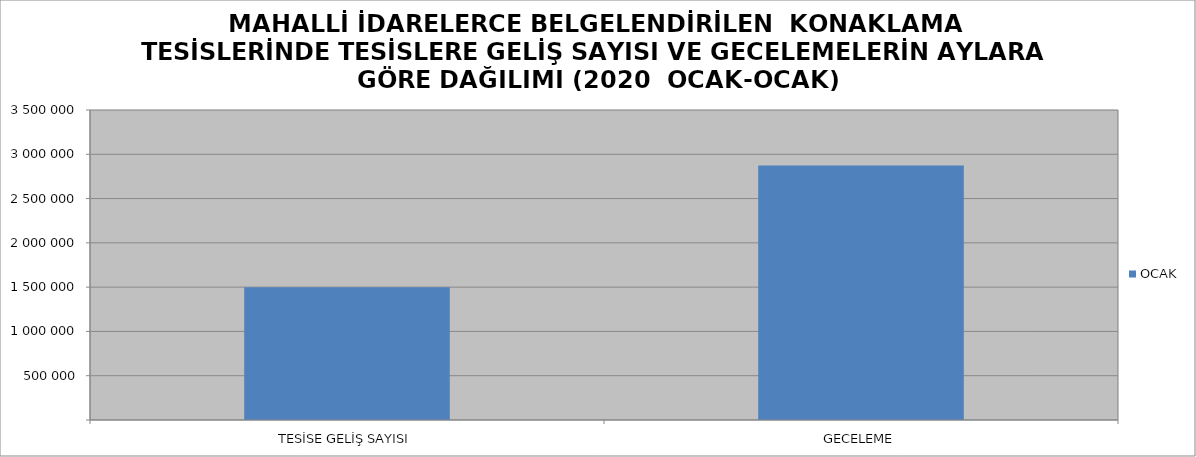
| Category | OCAK |
|---|---|
| TESİSE GELİŞ SAYISI | 1497815 |
| GECELEME | 2872303 |